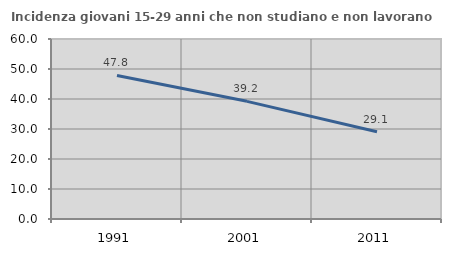
| Category | Incidenza giovani 15-29 anni che non studiano e non lavorano  |
|---|---|
| 1991.0 | 47.839 |
| 2001.0 | 39.218 |
| 2011.0 | 29.088 |